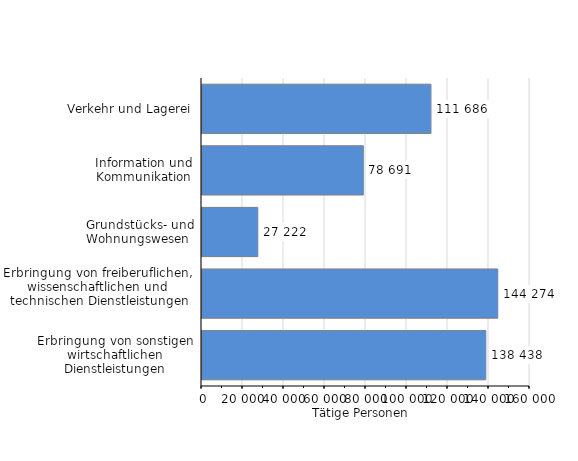
| Category | Tätige Personen |
|---|---|
| Verkehr und Lagerei | 111686 |
| Information und Kommunikation | 78691 |
| Grundstücks- und Wohnungswesen  | 27222 |
| Erbringung von freiberuflichen, 
wissenschaftlichen und 
technischen Dienstleistungen | 144274 |
| Erbringung von sonstigen wirtschaftlichen Dienstleistungen | 138438 |